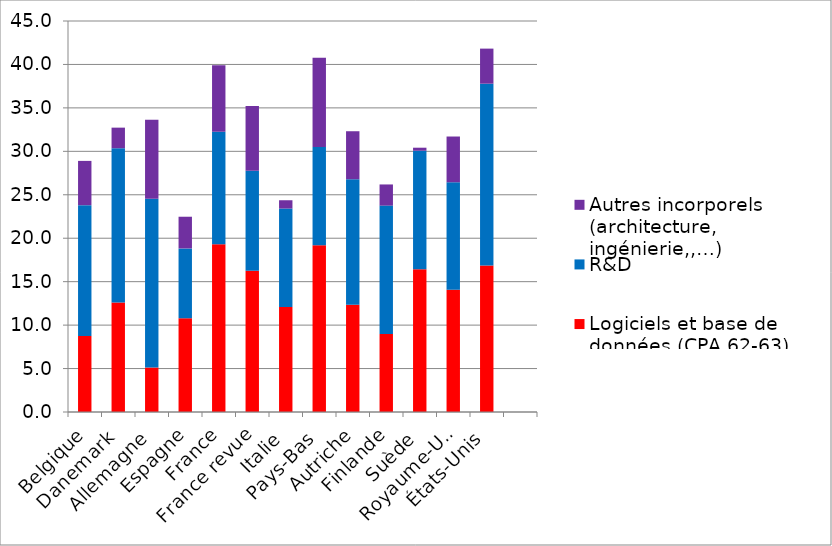
| Category | Logiciels et base de données (CPA 62-63) | R&D | Autres incorporels (architecture, ingénierie,,…) |
|---|---|---|---|
| Belgique | 8.756 | 15.047 | 5.096 |
| Danemark | 12.6 | 17.76 | 2.367 |
| Allemagne | 5.118 | 19.431 | 9.1 |
| Espagne | 10.789 | 8.037 | 3.648 |
| France | 19.318 | 12.93 | 7.667 |
| France revue | 16.252 | 11.517 | 7.458 |
| Italie | 12.071 | 11.346 | 0.954 |
| Pays-Bas | 19.192 | 11.32 | 10.249 |
| Autriche | 12.347 | 14.443 | 5.524 |
| Finlande | 8.974 | 14.779 | 2.435 |
| Suède | 16.434 | 13.635 | 0.348 |
| Royaume-Uni | 14.06 | 12.381 | 5.265 |
| États-Unis | 16.855 | 20.928 | 4.039 |